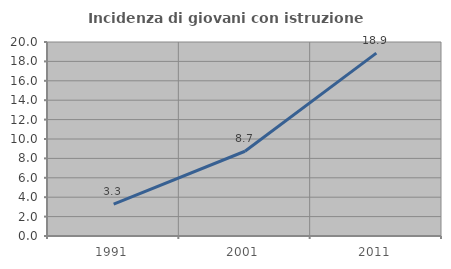
| Category | Incidenza di giovani con istruzione universitaria |
|---|---|
| 1991.0 | 3.285 |
| 2001.0 | 8.738 |
| 2011.0 | 18.852 |